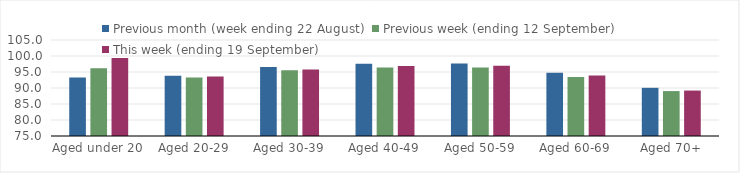
| Category | Previous month (week ending 22 August) | Previous week (ending 12 September) | This week (ending 19 September) |
|---|---|---|---|
| Aged under 20 | 93.31 | 96.2 | 99.35 |
| Aged 20-29 | 93.82 | 93.28 | 93.61 |
| Aged 30-39 | 96.57 | 95.52 | 95.78 |
| Aged 40-49 | 97.6 | 96.41 | 96.88 |
| Aged 50-59 | 97.68 | 96.39 | 96.98 |
| Aged 60-69 | 94.78 | 93.42 | 93.93 |
| Aged 70+ | 90.06 | 89.04 | 89.2 |